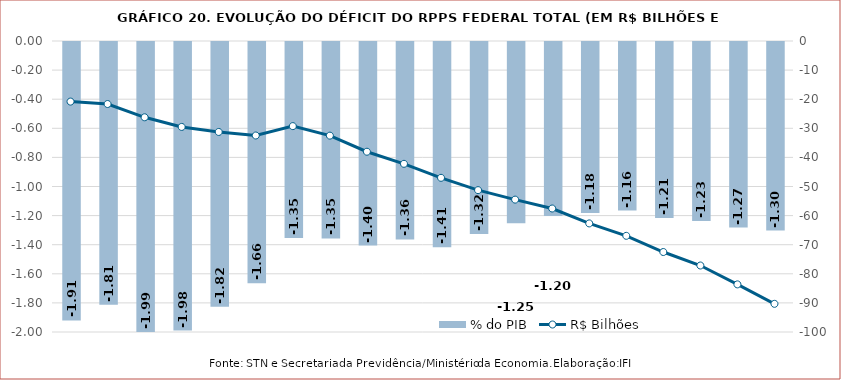
| Category | % do PIB |
|---|---|
| 1999.0 | -1.914 |
| 2000.0 | -1.806 |
| 2001.0 | -1.993 |
| 2002.0 | -1.983 |
| 2003.0 | -1.819 |
| 2004.0 | -1.659 |
| 2005.0 | -1.348 |
| 2006.0 | -1.35 |
| 2007.0 | -1.399 |
| 2008.0 | -1.357 |
| 2009.0 | -1.411 |
| 2010.0 | -1.319 |
| 2011.0 | -1.245 |
| 2012.0 | -1.196 |
| 2013.0 | -1.176 |
| 2014.0 | -1.158 |
| 2015.0 | -1.209 |
| 2016.0 | -1.231 |
| 2017.0 | -1.275 |
| 2018.0 | -1.296 |